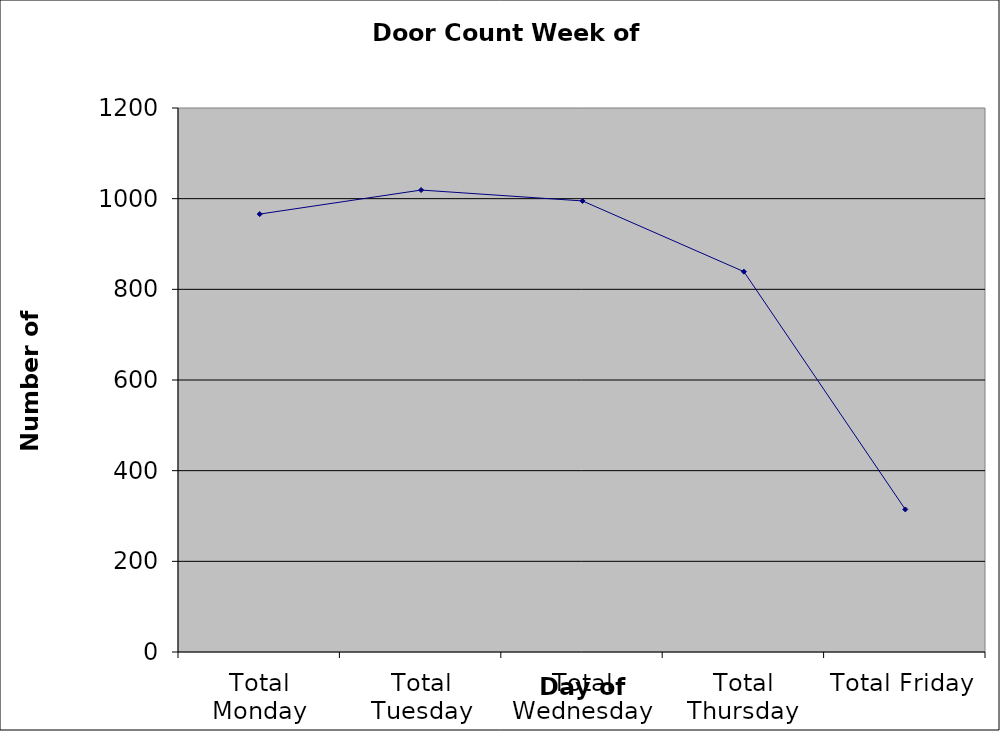
| Category | Series 0 |
|---|---|
| Total Monday | 966 |
| Total Tuesday | 1019 |
| Total Wednesday | 995 |
| Total Thursday | 839 |
| Total Friday | 314.5 |